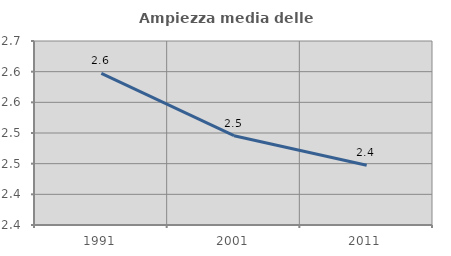
| Category | Ampiezza media delle famiglie |
|---|---|
| 1991.0 | 2.597 |
| 2001.0 | 2.496 |
| 2011.0 | 2.447 |